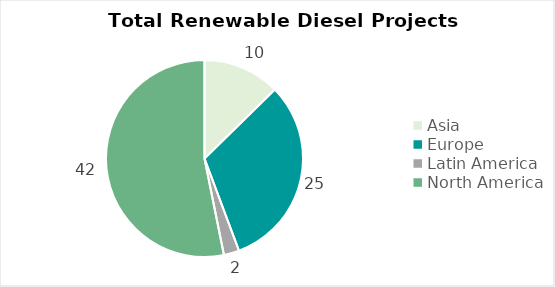
| Category | Count of Company | Sum of Capacity (Million Gallons (MGY)) | Sum of Capacity (MT) |
|---|---|---|---|
| Asia | 10 | 813.12 | 3035000 |
| Europe | 25 | 2049.502 | 8026000 |
| Latin America | 2 | 436 | 1403150 |
| North America | 42 | 10315.622 | 27292653 |